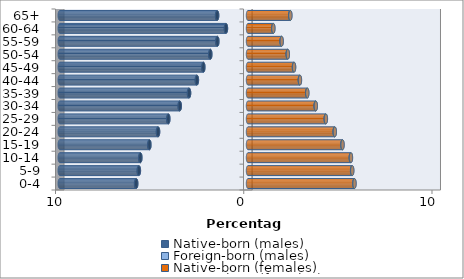
| Category | Native-born (males) | Foreign-born (males) | Native-born (females) | Foreign-born (females) |
|---|---|---|---|---|
| 0-4 | -5.938 | -0.012 | 5.649 | 0.011 |
| 5-9 | -5.796 | -0.012 | 5.529 | 0.011 |
| 10-14 | -5.718 | -0.011 | 5.461 | 0.01 |
| 15-19 | -5.238 | -0.011 | 5.014 | 0.01 |
| 20-24 | -4.777 | -0.01 | 4.603 | 0.01 |
| 25-29 | -4.232 | -0.01 | 4.13 | 0.009 |
| 30-34 | -3.625 | -0.009 | 3.594 | 0.008 |
| 35-39 | -3.131 | -0.008 | 3.144 | 0.007 |
| 40-44 | -2.714 | -0.007 | 2.755 | 0.006 |
| 45-49 | -2.372 | -0.006 | 2.443 | 0.005 |
| 50-54 | -2.002 | -0.005 | 2.11 | 0.005 |
| 55-59 | -1.628 | -0.004 | 1.785 | 0.004 |
| 60-64 | -1.171 | -0.003 | 1.343 | 0.003 |
| 65+ | -1.64 | -0.005 | 2.244 | 0.005 |